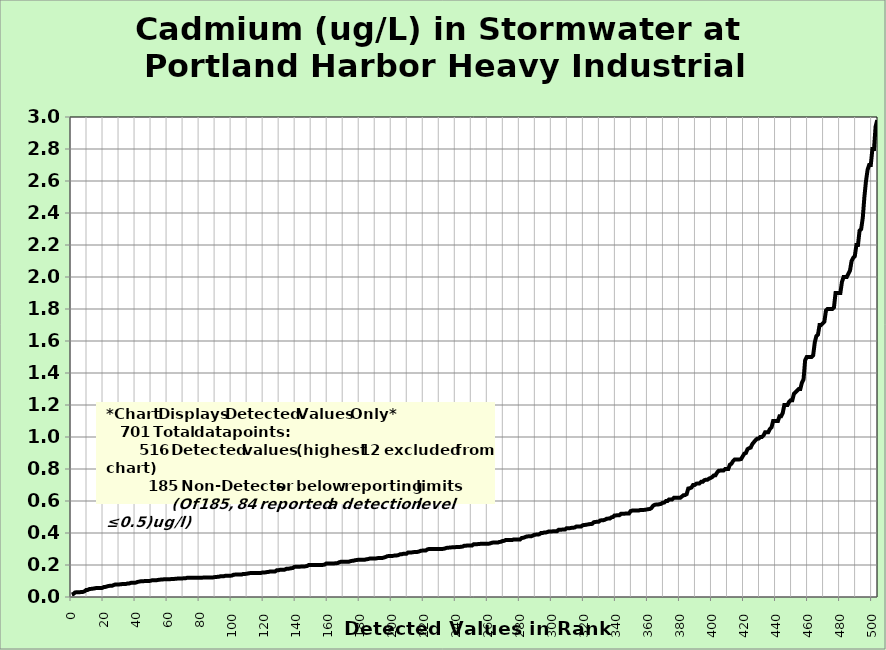
| Category | Cadmium |
|---|---|
| 0.0 | 0.015 |
| 1.0 | 0.019 |
| 2.0 | 0.028 |
| 3.0 | 0.03 |
| 4.0 | 0.03 |
| 5.0 | 0.03 |
| 6.0 | 0.031 |
| 7.0 | 0.032 |
| 8.0 | 0.036 |
| 9.0 | 0.044 |
| 10.0 | 0.044 |
| 11.0 | 0.05 |
| 12.0 | 0.051 |
| 13.0 | 0.052 |
| 14.0 | 0.053 |
| 15.0 | 0.056 |
| 16.0 | 0.056 |
| 17.0 | 0.056 |
| 18.0 | 0.056 |
| 19.0 | 0.057 |
| 20.0 | 0.062 |
| 21.0 | 0.063 |
| 22.0 | 0.066 |
| 23.0 | 0.069 |
| 24.0 | 0.07 |
| 25.0 | 0.07 |
| 26.0 | 0.074 |
| 27.0 | 0.078 |
| 28.0 | 0.078 |
| 29.0 | 0.078 |
| 30.0 | 0.079 |
| 31.0 | 0.08 |
| 32.0 | 0.082 |
| 33.0 | 0.082 |
| 34.0 | 0.082 |
| 35.0 | 0.085 |
| 36.0 | 0.085 |
| 37.0 | 0.089 |
| 38.0 | 0.089 |
| 39.0 | 0.089 |
| 40.0 | 0.09 |
| 41.0 | 0.094 |
| 42.0 | 0.096 |
| 43.0 | 0.098 |
| 44.0 | 0.098 |
| 45.0 | 0.099 |
| 46.0 | 0.1 |
| 47.0 | 0.1 |
| 48.0 | 0.1 |
| 49.0 | 0.101 |
| 50.0 | 0.104 |
| 51.0 | 0.104 |
| 52.0 | 0.104 |
| 53.0 | 0.105 |
| 54.0 | 0.107 |
| 55.0 | 0.108 |
| 56.0 | 0.11 |
| 57.0 | 0.11 |
| 58.0 | 0.111 |
| 59.0 | 0.111 |
| 60.0 | 0.111 |
| 61.0 | 0.111 |
| 62.0 | 0.112 |
| 63.0 | 0.112 |
| 64.0 | 0.113 |
| 65.0 | 0.114 |
| 66.0 | 0.115 |
| 67.0 | 0.115 |
| 68.0 | 0.115 |
| 69.0 | 0.116 |
| 70.0 | 0.117 |
| 71.0 | 0.117 |
| 72.0 | 0.12 |
| 73.0 | 0.12 |
| 74.0 | 0.12 |
| 75.0 | 0.12 |
| 76.0 | 0.12 |
| 77.0 | 0.12 |
| 78.0 | 0.12 |
| 79.0 | 0.12 |
| 80.0 | 0.12 |
| 81.0 | 0.121 |
| 82.0 | 0.121 |
| 83.0 | 0.122 |
| 84.0 | 0.122 |
| 85.0 | 0.122 |
| 86.0 | 0.122 |
| 87.0 | 0.122 |
| 88.0 | 0.122 |
| 89.0 | 0.124 |
| 90.0 | 0.125 |
| 91.0 | 0.126 |
| 92.0 | 0.127 |
| 93.0 | 0.13 |
| 94.0 | 0.13 |
| 95.0 | 0.13 |
| 96.0 | 0.133 |
| 97.0 | 0.133 |
| 98.0 | 0.133 |
| 99.0 | 0.133 |
| 100.0 | 0.134 |
| 101.0 | 0.139 |
| 102.0 | 0.14 |
| 103.0 | 0.14 |
| 104.0 | 0.14 |
| 105.0 | 0.14 |
| 106.0 | 0.14 |
| 107.0 | 0.144 |
| 108.0 | 0.144 |
| 109.0 | 0.145 |
| 110.0 | 0.147 |
| 111.0 | 0.149 |
| 112.0 | 0.15 |
| 113.0 | 0.15 |
| 114.0 | 0.15 |
| 115.0 | 0.15 |
| 116.0 | 0.15 |
| 117.0 | 0.15 |
| 118.0 | 0.15 |
| 119.0 | 0.153 |
| 120.0 | 0.153 |
| 121.0 | 0.154 |
| 122.0 | 0.156 |
| 123.0 | 0.157 |
| 124.0 | 0.16 |
| 125.0 | 0.16 |
| 126.0 | 0.16 |
| 127.0 | 0.16 |
| 128.0 | 0.167 |
| 129.0 | 0.167 |
| 130.0 | 0.17 |
| 131.0 | 0.17 |
| 132.0 | 0.17 |
| 133.0 | 0.171 |
| 134.0 | 0.176 |
| 135.0 | 0.176 |
| 136.0 | 0.178 |
| 137.0 | 0.18 |
| 138.0 | 0.181 |
| 139.0 | 0.188 |
| 140.0 | 0.189 |
| 141.0 | 0.189 |
| 142.0 | 0.189 |
| 143.0 | 0.19 |
| 144.0 | 0.19 |
| 145.0 | 0.19 |
| 146.0 | 0.192 |
| 147.0 | 0.194 |
| 148.0 | 0.2 |
| 149.0 | 0.2 |
| 150.0 | 0.2 |
| 151.0 | 0.2 |
| 152.0 | 0.2 |
| 153.0 | 0.2 |
| 154.0 | 0.2 |
| 155.0 | 0.2 |
| 156.0 | 0.2 |
| 157.0 | 0.201 |
| 158.0 | 0.203 |
| 159.0 | 0.21 |
| 160.0 | 0.21 |
| 161.0 | 0.21 |
| 162.0 | 0.21 |
| 163.0 | 0.21 |
| 164.0 | 0.21 |
| 165.0 | 0.211 |
| 166.0 | 0.212 |
| 167.0 | 0.217 |
| 168.0 | 0.22 |
| 169.0 | 0.22 |
| 170.0 | 0.22 |
| 171.0 | 0.22 |
| 172.0 | 0.22 |
| 173.0 | 0.22 |
| 174.0 | 0.224 |
| 175.0 | 0.226 |
| 176.0 | 0.227 |
| 177.0 | 0.23 |
| 178.0 | 0.231 |
| 179.0 | 0.233 |
| 180.0 | 0.233 |
| 181.0 | 0.233 |
| 182.0 | 0.233 |
| 183.0 | 0.233 |
| 184.0 | 0.236 |
| 185.0 | 0.237 |
| 186.0 | 0.24 |
| 187.0 | 0.24 |
| 188.0 | 0.24 |
| 189.0 | 0.241 |
| 190.0 | 0.241 |
| 191.0 | 0.243 |
| 192.0 | 0.244 |
| 193.0 | 0.244 |
| 194.0 | 0.244 |
| 195.0 | 0.247 |
| 196.0 | 0.25 |
| 197.0 | 0.255 |
| 198.0 | 0.256 |
| 199.0 | 0.256 |
| 200.0 | 0.256 |
| 201.0 | 0.258 |
| 202.0 | 0.26 |
| 203.0 | 0.26 |
| 204.0 | 0.262 |
| 205.0 | 0.267 |
| 206.0 | 0.267 |
| 207.0 | 0.27 |
| 208.0 | 0.27 |
| 209.0 | 0.27 |
| 210.0 | 0.278 |
| 211.0 | 0.278 |
| 212.0 | 0.278 |
| 213.0 | 0.28 |
| 214.0 | 0.281 |
| 215.0 | 0.281 |
| 216.0 | 0.282 |
| 217.0 | 0.285 |
| 218.0 | 0.289 |
| 219.0 | 0.29 |
| 220.0 | 0.29 |
| 221.0 | 0.29 |
| 222.0 | 0.297 |
| 223.0 | 0.3 |
| 224.0 | 0.3 |
| 225.0 | 0.3 |
| 226.0 | 0.3 |
| 227.0 | 0.3 |
| 228.0 | 0.3 |
| 229.0 | 0.3 |
| 230.0 | 0.3 |
| 231.0 | 0.3 |
| 232.0 | 0.301 |
| 233.0 | 0.303 |
| 234.0 | 0.307 |
| 235.0 | 0.308 |
| 236.0 | 0.309 |
| 237.0 | 0.31 |
| 238.0 | 0.311 |
| 239.0 | 0.311 |
| 240.0 | 0.312 |
| 241.0 | 0.312 |
| 242.0 | 0.312 |
| 243.0 | 0.314 |
| 244.0 | 0.315 |
| 245.0 | 0.32 |
| 246.0 | 0.32 |
| 247.0 | 0.322 |
| 248.0 | 0.322 |
| 249.0 | 0.322 |
| 250.0 | 0.322 |
| 251.0 | 0.33 |
| 252.0 | 0.33 |
| 253.0 | 0.33 |
| 254.0 | 0.331 |
| 255.0 | 0.332 |
| 256.0 | 0.333 |
| 257.0 | 0.333 |
| 258.0 | 0.333 |
| 259.0 | 0.333 |
| 260.0 | 0.333 |
| 261.0 | 0.334 |
| 262.0 | 0.338 |
| 263.0 | 0.34 |
| 264.0 | 0.34 |
| 265.0 | 0.34 |
| 266.0 | 0.34 |
| 267.0 | 0.344 |
| 268.0 | 0.345 |
| 269.0 | 0.35 |
| 270.0 | 0.351 |
| 271.0 | 0.356 |
| 272.0 | 0.356 |
| 273.0 | 0.356 |
| 274.0 | 0.356 |
| 275.0 | 0.356 |
| 276.0 | 0.36 |
| 277.0 | 0.36 |
| 278.0 | 0.36 |
| 279.0 | 0.36 |
| 280.0 | 0.36 |
| 281.0 | 0.369 |
| 282.0 | 0.37 |
| 283.0 | 0.374 |
| 284.0 | 0.378 |
| 285.0 | 0.379 |
| 286.0 | 0.38 |
| 287.0 | 0.38 |
| 288.0 | 0.384 |
| 289.0 | 0.389 |
| 290.0 | 0.39 |
| 291.0 | 0.39 |
| 292.0 | 0.392 |
| 293.0 | 0.4 |
| 294.0 | 0.4 |
| 295.0 | 0.403 |
| 296.0 | 0.403 |
| 297.0 | 0.406 |
| 298.0 | 0.41 |
| 299.0 | 0.41 |
| 300.0 | 0.41 |
| 301.0 | 0.411 |
| 302.0 | 0.411 |
| 303.0 | 0.411 |
| 304.0 | 0.42 |
| 305.0 | 0.42 |
| 306.0 | 0.421 |
| 307.0 | 0.422 |
| 308.0 | 0.422 |
| 309.0 | 0.43 |
| 310.0 | 0.43 |
| 311.0 | 0.43 |
| 312.0 | 0.432 |
| 313.0 | 0.433 |
| 314.0 | 0.434 |
| 315.0 | 0.44 |
| 316.0 | 0.44 |
| 317.0 | 0.44 |
| 318.0 | 0.44 |
| 319.0 | 0.448 |
| 320.0 | 0.45 |
| 321.0 | 0.451 |
| 322.0 | 0.453 |
| 323.0 | 0.455 |
| 324.0 | 0.456 |
| 325.0 | 0.457 |
| 326.0 | 0.467 |
| 327.0 | 0.469 |
| 328.0 | 0.47 |
| 329.0 | 0.47 |
| 330.0 | 0.478 |
| 331.0 | 0.48 |
| 332.0 | 0.48 |
| 333.0 | 0.483 |
| 334.0 | 0.489 |
| 335.0 | 0.49 |
| 336.0 | 0.49 |
| 337.0 | 0.498 |
| 338.0 | 0.5 |
| 339.0 | 0.51 |
| 340.0 | 0.51 |
| 341.0 | 0.511 |
| 342.0 | 0.511 |
| 343.0 | 0.52 |
| 344.0 | 0.52 |
| 345.0 | 0.52 |
| 346.0 | 0.522 |
| 347.0 | 0.522 |
| 348.0 | 0.522 |
| 349.0 | 0.537 |
| 350.0 | 0.54 |
| 351.0 | 0.54 |
| 352.0 | 0.54 |
| 353.0 | 0.54 |
| 354.0 | 0.54 |
| 355.0 | 0.544 |
| 356.0 | 0.544 |
| 357.0 | 0.544 |
| 358.0 | 0.545 |
| 359.0 | 0.547 |
| 360.0 | 0.549 |
| 361.0 | 0.55 |
| 362.0 | 0.556 |
| 363.0 | 0.57 |
| 364.0 | 0.576 |
| 365.0 | 0.578 |
| 366.0 | 0.578 |
| 367.0 | 0.58 |
| 368.0 | 0.582 |
| 369.0 | 0.589 |
| 370.0 | 0.59 |
| 371.0 | 0.6 |
| 372.0 | 0.6 |
| 373.0 | 0.61 |
| 374.0 | 0.61 |
| 375.0 | 0.61 |
| 376.0 | 0.62 |
| 377.0 | 0.62 |
| 378.0 | 0.62 |
| 379.0 | 0.62 |
| 380.0 | 0.62 |
| 381.0 | 0.628 |
| 382.0 | 0.636 |
| 383.0 | 0.637 |
| 384.0 | 0.643 |
| 385.0 | 0.678 |
| 386.0 | 0.68 |
| 387.0 | 0.684 |
| 388.0 | 0.7 |
| 389.0 | 0.7 |
| 390.0 | 0.708 |
| 391.0 | 0.71 |
| 392.0 | 0.71 |
| 393.0 | 0.72 |
| 394.0 | 0.72 |
| 395.0 | 0.73 |
| 396.0 | 0.733 |
| 397.0 | 0.733 |
| 398.0 | 0.74 |
| 399.0 | 0.744 |
| 400.0 | 0.75 |
| 401.0 | 0.76 |
| 402.0 | 0.761 |
| 403.0 | 0.778 |
| 404.0 | 0.789 |
| 405.0 | 0.79 |
| 406.0 | 0.79 |
| 407.0 | 0.79 |
| 408.0 | 0.8 |
| 409.0 | 0.8 |
| 410.0 | 0.8 |
| 411.0 | 0.827 |
| 412.0 | 0.833 |
| 413.0 | 0.85 |
| 414.0 | 0.86 |
| 415.0 | 0.86 |
| 416.0 | 0.86 |
| 417.0 | 0.86 |
| 418.0 | 0.862 |
| 419.0 | 0.879 |
| 420.0 | 0.896 |
| 421.0 | 0.9 |
| 422.0 | 0.924 |
| 423.0 | 0.93 |
| 424.0 | 0.934 |
| 425.0 | 0.956 |
| 426.0 | 0.968 |
| 427.0 | 0.98 |
| 428.0 | 0.989 |
| 429.0 | 0.99 |
| 430.0 | 1 |
| 431.0 | 1 |
| 432.0 | 1.01 |
| 433.0 | 1.03 |
| 434.0 | 1.03 |
| 435.0 | 1.03 |
| 436.0 | 1.05 |
| 437.0 | 1.06 |
| 438.0 | 1.1 |
| 439.0 | 1.1 |
| 440.0 | 1.1 |
| 441.0 | 1.1 |
| 442.0 | 1.13 |
| 443.0 | 1.13 |
| 444.0 | 1.15 |
| 445.0 | 1.2 |
| 446.0 | 1.2 |
| 447.0 | 1.2 |
| 448.0 | 1.22 |
| 449.0 | 1.23 |
| 450.0 | 1.23 |
| 451.0 | 1.27 |
| 452.0 | 1.28 |
| 453.0 | 1.29 |
| 454.0 | 1.3 |
| 455.0 | 1.3 |
| 456.0 | 1.34 |
| 457.0 | 1.36 |
| 458.0 | 1.48 |
| 459.0 | 1.5 |
| 460.0 | 1.5 |
| 461.0 | 1.5 |
| 462.0 | 1.5 |
| 463.0 | 1.51 |
| 464.0 | 1.59 |
| 465.0 | 1.63 |
| 466.0 | 1.64 |
| 467.0 | 1.7 |
| 468.0 | 1.7 |
| 469.0 | 1.71 |
| 470.0 | 1.72 |
| 471.0 | 1.79 |
| 472.0 | 1.8 |
| 473.0 | 1.8 |
| 474.0 | 1.8 |
| 475.0 | 1.8 |
| 476.0 | 1.81 |
| 477.0 | 1.9 |
| 478.0 | 1.9 |
| 479.0 | 1.9 |
| 480.0 | 1.9 |
| 481.0 | 1.97 |
| 482.0 | 2 |
| 483.0 | 2 |
| 484.0 | 2 |
| 485.0 | 2.02 |
| 486.0 | 2.04 |
| 487.0 | 2.1 |
| 488.0 | 2.12 |
| 489.0 | 2.13 |
| 490.0 | 2.2 |
| 491.0 | 2.2 |
| 492.0 | 2.29 |
| 493.0 | 2.3 |
| 494.0 | 2.37 |
| 495.0 | 2.5 |
| 496.0 | 2.6 |
| 497.0 | 2.67 |
| 498.0 | 2.7 |
| 499.0 | 2.7 |
| 500.0 | 2.8 |
| 501.0 | 2.8 |
| 502.0 | 2.94 |
| 503.0 | 2.98 |